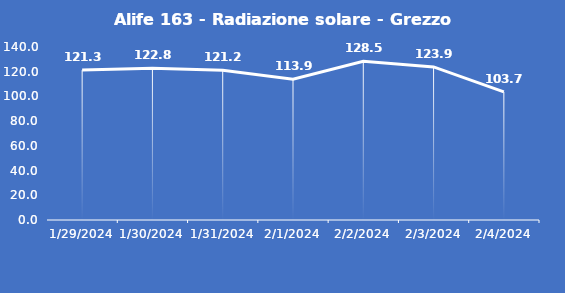
| Category | Alife 163 - Radiazione solare - Grezzo (W/m2) |
|---|---|
| 1/29/24 | 121.3 |
| 1/30/24 | 122.8 |
| 1/31/24 | 121.2 |
| 2/1/24 | 113.9 |
| 2/2/24 | 128.5 |
| 2/3/24 | 123.9 |
| 2/4/24 | 103.7 |